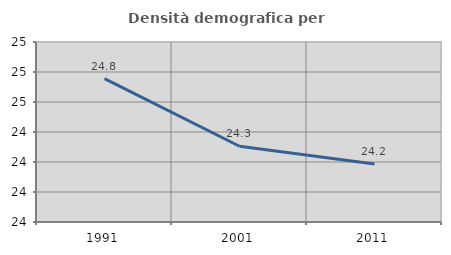
| Category | Densità demografica |
|---|---|
| 1991.0 | 24.755 |
| 2001.0 | 24.305 |
| 2011.0 | 24.187 |